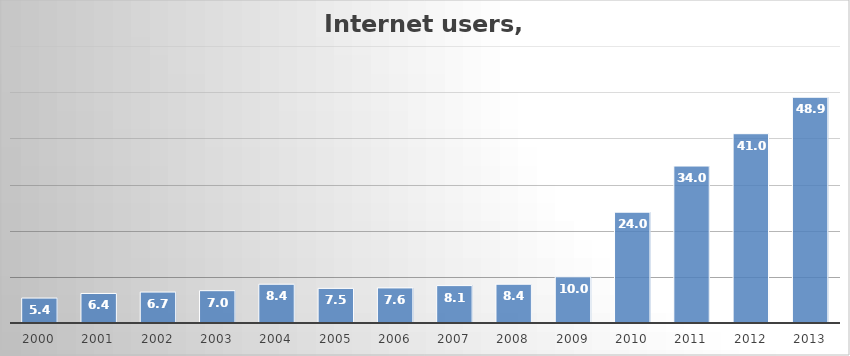
| Category | Rate per 100 of the population |
|---|---|
| 2000.0 | 5.4 |
| 2001.0 | 6.4 |
| 2002.0 | 6.7 |
| 2003.0 | 7 |
| 2004.0 | 8.4 |
| 2005.0 | 7.5 |
| 2006.0 | 7.6 |
| 2007.0 | 8.1 |
| 2008.0 | 8.4 |
| 2009.0 | 10 |
| 2010.0 | 24 |
| 2011.0 | 34 |
| 2012.0 | 41 |
| 2013.0 | 48.9 |